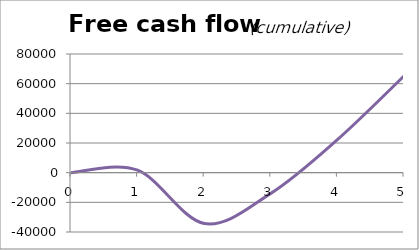
| Category | Free cash flow (cumulative) |
|---|---|
| 0.0 | 0 |
| 1.0 | 1650.959 |
| 2.0 | -34208.66 |
| 3.0 | -13950.453 |
| 4.0 | 22265.711 |
| 5.0 | 65163.59 |